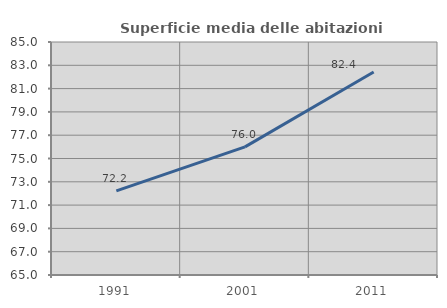
| Category | Superficie media delle abitazioni occupate |
|---|---|
| 1991.0 | 72.218 |
| 2001.0 | 76 |
| 2011.0 | 82.418 |